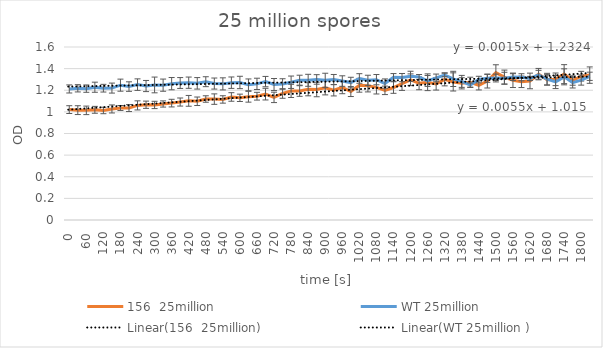
| Category | 156  25million | WT 25million  |
|---|---|---|
| 0.0 | 1.021 | 1.212 |
| 30.0 | 1.016 | 1.218 |
| 60.0 | 1.014 | 1.215 |
| 90.0 | 1.019 | 1.228 |
| 120.0 | 1.013 | 1.219 |
| 150.0 | 1.027 | 1.22 |
| 180.0 | 1.036 | 1.247 |
| 210.0 | 1.035 | 1.234 |
| 240.0 | 1.06 | 1.252 |
| 270.0 | 1.066 | 1.239 |
| 300.0 | 1.064 | 1.249 |
| 330.0 | 1.073 | 1.247 |
| 360.0 | 1.081 | 1.261 |
| 390.0 | 1.091 | 1.267 |
| 420.0 | 1.102 | 1.27 |
| 450.0 | 1.098 | 1.264 |
| 480.0 | 1.119 | 1.279 |
| 510.0 | 1.118 | 1.262 |
| 540.0 | 1.115 | 1.259 |
| 570.0 | 1.138 | 1.27 |
| 600.0 | 1.13 | 1.272 |
| 630.0 | 1.14 | 1.25 |
| 660.0 | 1.145 | 1.259 |
| 690.0 | 1.164 | 1.28 |
| 720.0 | 1.134 | 1.253 |
| 750.0 | 1.17 | 1.258 |
| 780.0 | 1.194 | 1.274 |
| 810.0 | 1.193 | 1.293 |
| 840.0 | 1.209 | 1.292 |
| 870.0 | 1.207 | 1.3 |
| 900.0 | 1.223 | 1.292 |
| 930.0 | 1.2 | 1.299 |
| 960.0 | 1.227 | 1.285 |
| 990.0 | 1.188 | 1.271 |
| 1020.0 | 1.246 | 1.309 |
| 1050.0 | 1.242 | 1.292 |
| 1080.0 | 1.227 | 1.298 |
| 1110.0 | 1.199 | 1.262 |
| 1140.0 | 1.225 | 1.319 |
| 1170.0 | 1.261 | 1.317 |
| 1200.0 | 1.297 | 1.329 |
| 1230.0 | 1.264 | 1.323 |
| 1260.0 | 1.274 | 1.286 |
| 1290.0 | 1.259 | 1.314 |
| 1320.0 | 1.301 | 1.341 |
| 1350.0 | 1.277 | 1.305 |
| 1380.0 | 1.264 | 1.282 |
| 1410.0 | 1.273 | 1.248 |
| 1440.0 | 1.246 | 1.299 |
| 1470.0 | 1.285 | 1.31 |
| 1500.0 | 1.363 | 1.313 |
| 1530.0 | 1.321 | 1.312 |
| 1560.0 | 1.292 | 1.322 |
| 1590.0 | 1.278 | 1.32 |
| 1620.0 | 1.286 | 1.309 |
| 1650.0 | 1.349 | 1.343 |
| 1680.0 | 1.298 | 1.302 |
| 1710.0 | 1.301 | 1.277 |
| 1740.0 | 1.349 | 1.324 |
| 1770.0 | 1.29 | 1.271 |
| 1800.0 | 1.33 | 1.294 |
| 1830.0 | 1.34 | 1.329 |